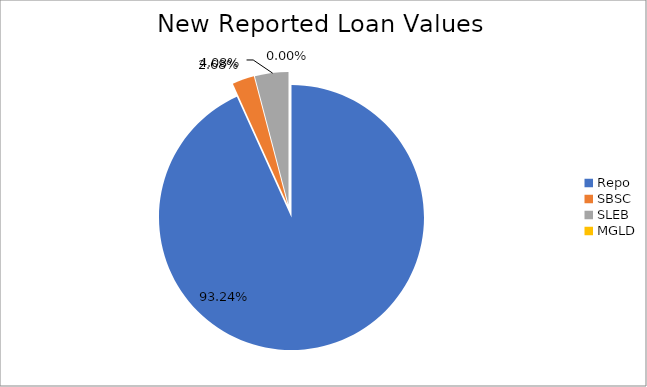
| Category | Series 0 |
|---|---|
| Repo | 10418660.162 |
| SBSC | 299181.47 |
| SLEB | 456337.923 |
| MGLD | 196.874 |